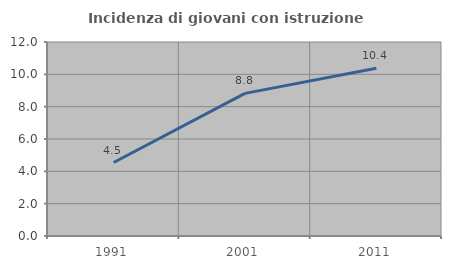
| Category | Incidenza di giovani con istruzione universitaria |
|---|---|
| 1991.0 | 4.545 |
| 2001.0 | 8.824 |
| 2011.0 | 10.377 |